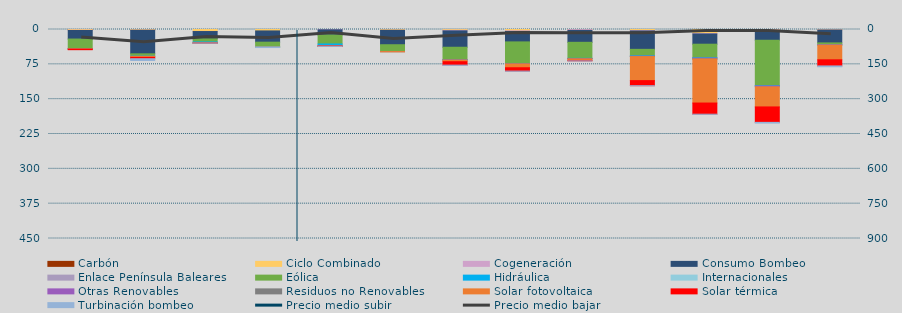
| Category | Carbón | Ciclo Combinado | Cogeneración | Consumo Bombeo | Enlace Península Baleares | Eólica | Hidráulica | Internacionales | Otras Renovables | Residuos no Renovables | Solar fotovoltaica | Solar térmica | Turbinación bombeo |
|---|---|---|---|---|---|---|---|---|---|---|---|---|---|
| 0 | 20 | 1489.042 | 599.786 | 18456.273 | 0 | 20881.86 | 87.748 | 0 | 304.724 | 12.55 | 573.462 | 1034.589 | 0 |
| 1 | 0 | 1431.5 | 183.958 | 50768.847 | 0 | 5100.208 | 273.474 | 0 | 90.045 | 0 | 2259.405 | 2752.042 | 3910.508 |
| 2 | 0 | 4345.9 | 27.314 | 15616.296 | 0 | 6806.453 | 2149.971 | 0 | 152.334 | 42.654 | 44.067 | 19 | 204.333 |
| 3 | 0 | 3059.067 | 0 | 24243.492 | 0 | 10425.232 | 13.796 | 0 | 0 | 0 | 9.194 | 0 | 1113.3 |
| 4 | 0 | 0 | 655.675 | 11045.084 | 0 | 19430.531 | 3297.137 | 0 | 1221.2 | 4.575 | 380.934 | 279.19 | 100 |
| 5 | 0 | 1578.425 | 97.391 | 31105.358 | 0 | 14760.555 | 0.525 | 0 | 6.9 | 0 | 610.128 | 0 | 0 |
| 6 | 0 | 1682.35 | 1288.318 | 35237.998 | 0 | 26715.501 | 538.936 | 0 | 327.466 | 97.457 | 3459.795 | 7401.339 | 450.583 |
| 7 | 0 | 2896.525 | 1320.794 | 22481.384 | 0 | 46423.207 | 245.293 | 0 | 655.227 | 248.362 | 8080.179 | 7222.305 | 292.5 |
| 8 | 0 | 199.85 | 1687.618 | 25714.166 | 0 | 34475.114 | 354.461 | 0 | 851.955 | 108.267 | 3215.484 | 949.057 | 183.208 |
| 9 | 0 | 2332.325 | 837.542 | 39583.668 | 0 | 13865.681 | 874.017 | 0 | 764.251 | 122.4 | 51660.192 | 10959.39 | 140 |
| 10 | 0 | 8570.193 | 1044.542 | 22062.469 | 0 | 29099.06 | 778.521 | 0 | 1951.311 | 135.5 | 94698.2 | 24041.497 | 242.133 |
| 11 | 0 | 898.7 | 918.519 | 21253.542 | 0 | 97910.858 | 671.55 | 0 | 1839.655 | 0 | 43222.778 | 33235.192 | 1586.933 |
| 12 | 0 | 958.3 | 215.177 | 27683.021 | 0 | 3999.405 | 139.925 | 0 | 560.625 | 0 | 31670.609 | 13214.049 | 1776.567 |